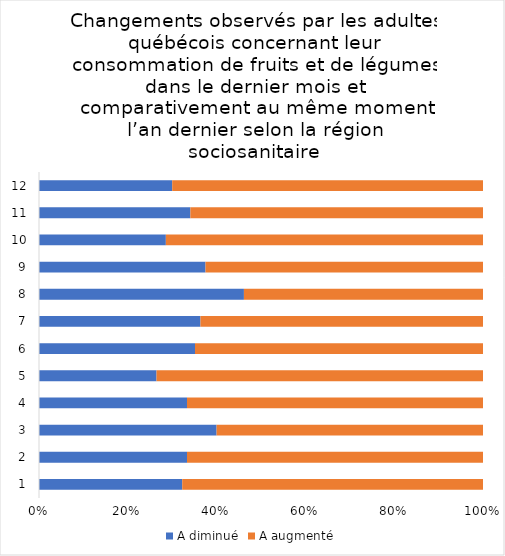
| Category | A diminué | A augmenté |
|---|---|---|
| 0 | 10 | 21 |
| 1 | 8 | 16 |
| 2 | 12 | 18 |
| 3 | 11 | 22 |
| 4 | 9 | 25 |
| 5 | 13 | 24 |
| 6 | 12 | 21 |
| 7 | 12 | 14 |
| 8 | 12 | 20 |
| 9 | 8 | 20 |
| 10 | 15 | 29 |
| 11 | 9 | 21 |